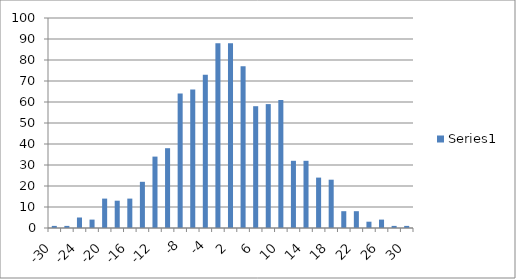
| Category | Series 0 |
|---|---|
| -30.0 | 1 |
| -26.0 | 1 |
| -24.0 | 5 |
| -22.0 | 4 |
| -20.0 | 14 |
| -18.0 | 13 |
| -16.0 | 14 |
| -14.0 | 22 |
| -12.0 | 34 |
| -10.0 | 38 |
| -8.0 | 64 |
| -6.0 | 66 |
| -4.0 | 73 |
| -2.0 | 88 |
| 2.0 | 88 |
| 4.0 | 77 |
| 6.0 | 58 |
| 8.0 | 59 |
| 10.0 | 61 |
| 12.0 | 32 |
| 14.0 | 32 |
| 16.0 | 24 |
| 18.0 | 23 |
| 20.0 | 8 |
| 22.0 | 8 |
| 24.0 | 3 |
| 26.0 | 4 |
| 28.0 | 1 |
| 30.0 | 1 |